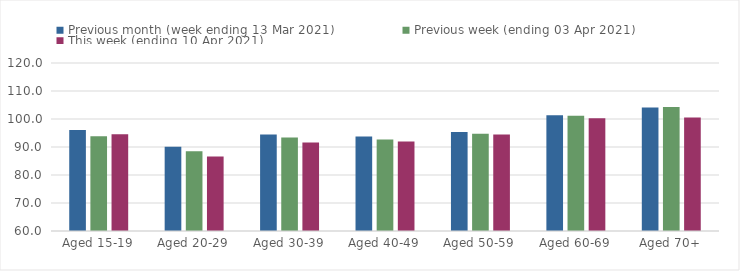
| Category | Previous month (week ending 13 Mar 2021) | Previous week (ending 03 Apr 2021) | This week (ending 10 Apr 2021) |
|---|---|---|---|
| Aged 15-19 | 96.05 | 93.81 | 94.51 |
| Aged 20-29 | 90.08 | 88.47 | 86.61 |
| Aged 30-39 | 94.5 | 93.42 | 91.63 |
| Aged 40-49 | 93.78 | 92.72 | 91.93 |
| Aged 50-59 | 95.35 | 94.77 | 94.48 |
| Aged 60-69 | 101.36 | 101.13 | 100.26 |
| Aged 70+ | 104.08 | 104.29 | 100.54 |